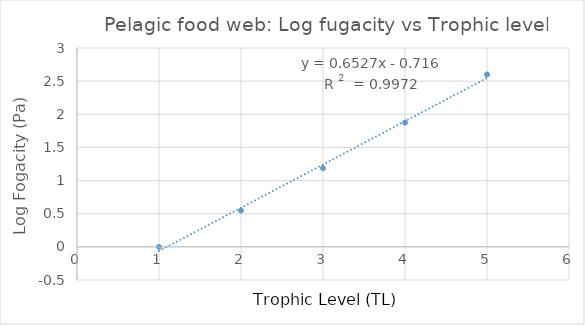
| Category | Log fugacity vs Trophic level |
|---|---|
| 1.0 | 0 |
| 2.0 | 0.548 |
| 3.0 | 1.187 |
| 4.0 | 1.875 |
| 5.0 | 2.6 |